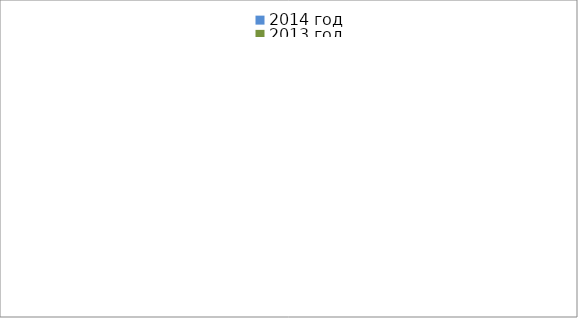
| Category | 2014 год | 2013 год |
|---|---|---|
|  - поджог | 2 | 11 |
|  - неосторожное обращение с огнём | 7 | 8 |
|  - НПТЭ электрооборудования | 2 | 14 |
|  - НПУ и Э печей | 23 | 15 |
|  - НПУ и Э транспортных средств | 25 | 29 |
|   -Шалость с огнем детей | 0 | 1 |
|  -НППБ при эксплуатации эл.приборов | 7 | 11 |
|  - курение | 3 | 3 |
| - прочие | 33 | 19 |
| - не установленные причины | 3 | 8 |